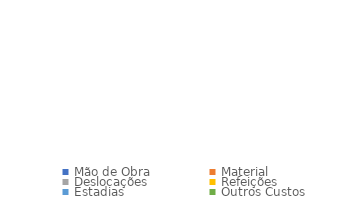
| Category | Series 0 |
|---|---|
| Mão de Obra | 0 |
| Material | 0 |
| Deslocações | 0 |
| Refeições | 0 |
| Estadias | 0 |
| Outros Custos | 0 |